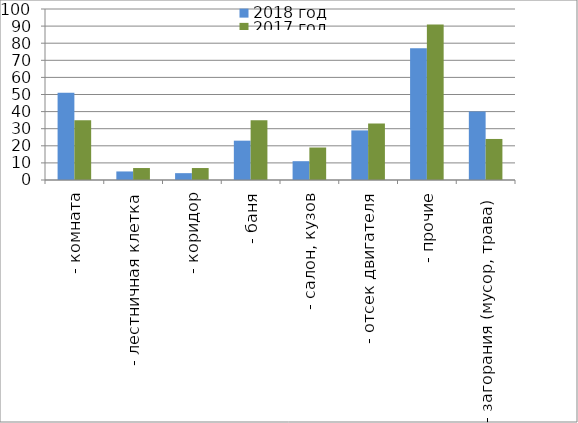
| Category | 2018 год | 2017 год |
|---|---|---|
|  - комната | 51 | 35 |
|  - лестничная клетка | 5 | 7 |
|  - коридор | 4 | 7 |
|  - баня | 23 | 35 |
|  - салон, кузов | 11 | 19 |
|  - отсек двигателя | 29 | 33 |
| - прочие | 77 | 91 |
| - загорания (мусор, трава)  | 40 | 24 |